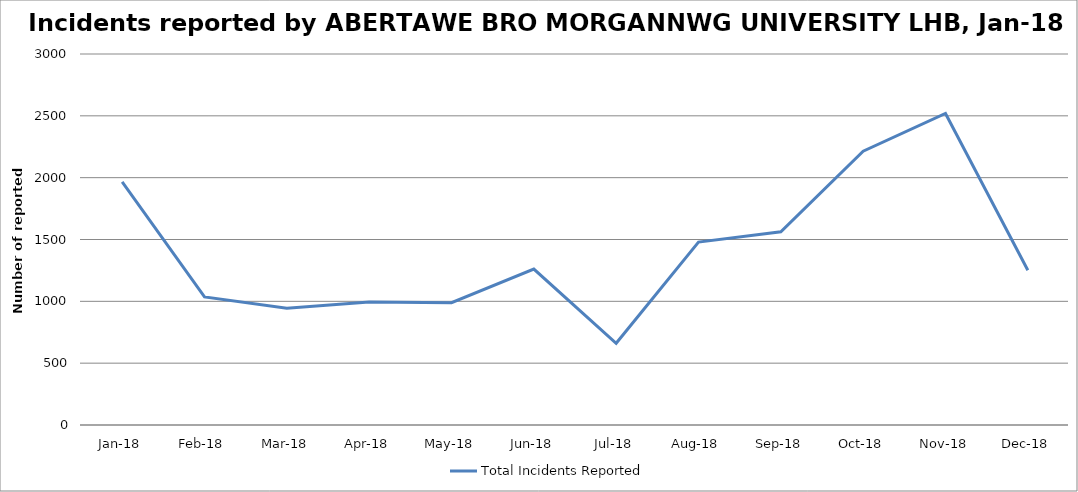
| Category | Total Incidents Reported |
|---|---|
| Jan-18 | 1965 |
| Feb-18 | 1036 |
| Mar-18 | 945 |
| Apr-18 | 994 |
| May-18 | 989 |
| Jun-18 | 1261 |
| Jul-18 | 661 |
| Aug-18 | 1479 |
| Sep-18 | 1562 |
| Oct-18 | 2214 |
| Nov-18 | 2519 |
| Dec-18 | 1251 |